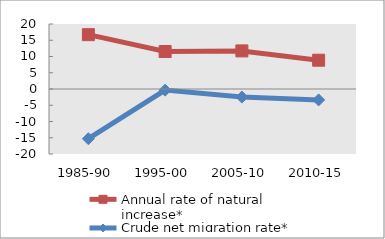
| Category | Annual rate of natural increase* | Crude net migration rate* |
|---|---|---|
| 1985-90 | 16.719 | -15.297 |
| 1995-00 | 11.536 | -0.348 |
| 2005-10 | 11.722 | -2.492 |
| 2010-15 | 8.86 | -3.354 |